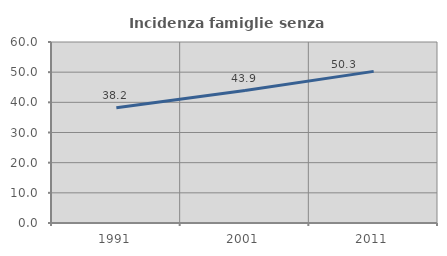
| Category | Incidenza famiglie senza nuclei |
|---|---|
| 1991.0 | 38.205 |
| 2001.0 | 43.922 |
| 2011.0 | 50.264 |